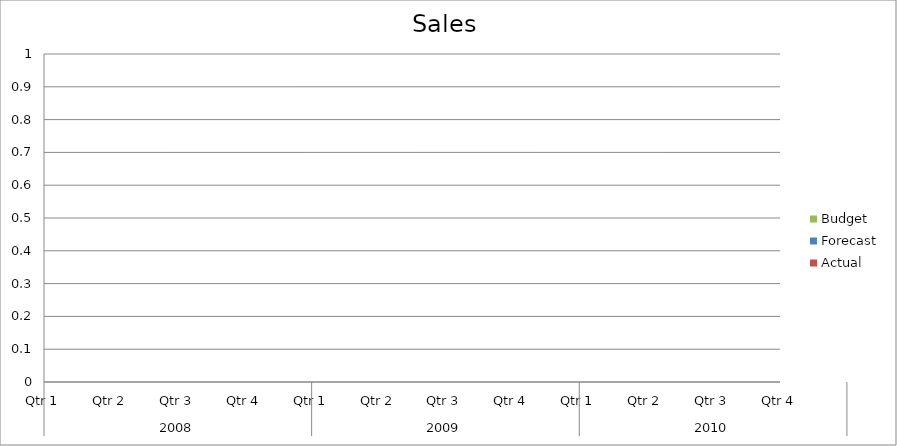
| Category | Budget | Forecast | Actual |
|---|---|---|---|
| 0 | 2980 | 3150 | 1750 |
| 1 | 2990 | 2080 | 1910 |
| 2 | 1140 | 1740 | 2250 |
| 3 | 3470 | 1490 | 1610 |
| 4 | 2350 | 1670 | 2220 |
| 5 | 840 | 1290 | 2470 |
| 6 | 3030 | 590 | 2630 |
| 7 | 2420 | 660 | 1280 |
| 8 | 1980 | 850 | 1500 |
| 9 | 1310 | 1400 | 3290 |
| 10 | 1950 | 2120 | 2080 |
| 11 | 2800 | 2900 | 1120 |